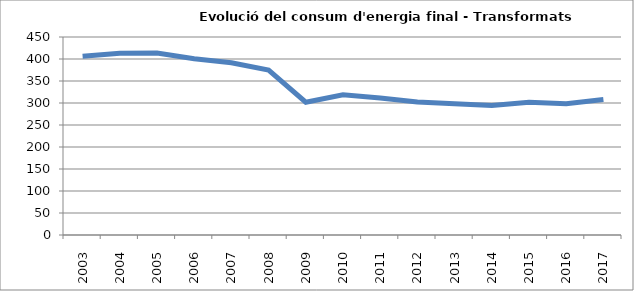
| Category | 406,4 413,2 413,6 400,5 391,6 374,8 301,7 318,8 311,5 302,3 298,4 294,2 301,6 298,4 308,2 |
|---|---|
| 2003.0 | 406.4 |
| 2004.0 | 413.2 |
| 2005.0 | 413.6 |
| 2006.0 | 400.5 |
| 2007.0 | 391.6 |
| 2008.0 | 374.8 |
| 2009.0 | 301.7 |
| 2010.0 | 318.8 |
| 2011.0 | 311.5 |
| 2012.0 | 302.3 |
| 2013.0 | 298.4 |
| 2014.0 | 294.2 |
| 2015.0 | 301.6 |
| 2016.0 | 298.4 |
| 2017.0 | 308.2 |